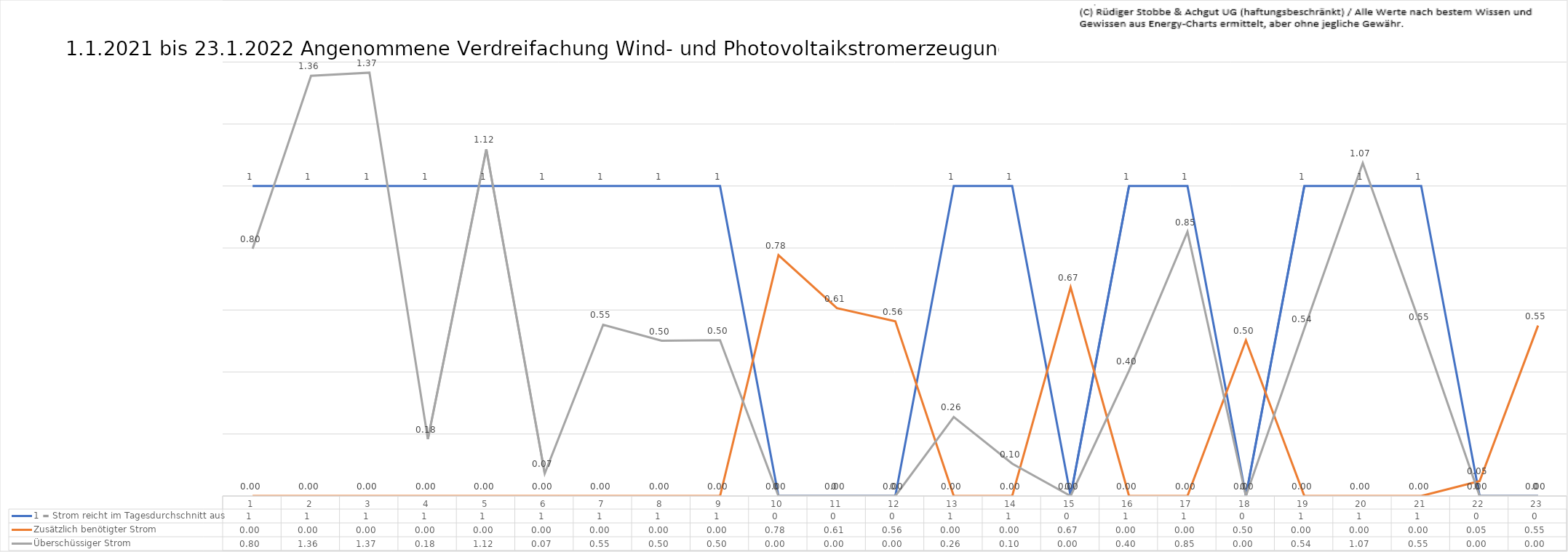
| Category | 1 = Strom reicht im Tagesdurchschnitt aus | Zusätzlich benötigter Strom | Überschüssiger Strom |
|---|---|---|---|
| 0 | 1 | 0 | 0.798 |
| 1 | 1 | 0 | 1.356 |
| 2 | 1 | 0 | 1.366 |
| 3 | 1 | 0 | 0.184 |
| 4 | 1 | 0 | 1.118 |
| 5 | 1 | 0 | 0.073 |
| 6 | 1 | 0 | 0.553 |
| 7 | 1 | 0 | 0.501 |
| 8 | 1 | 0 | 0.503 |
| 9 | 0 | 0.777 | 0 |
| 10 | 0 | 0.606 | 0 |
| 11 | 0 | 0.563 | 0 |
| 12 | 1 | 0 | 0.255 |
| 13 | 1 | 0 | 0.104 |
| 14 | 0 | 0.673 | 0 |
| 15 | 1 | 0 | 0.405 |
| 16 | 1 | 0 | 0.852 |
| 17 | 0 | 0.502 | 0 |
| 18 | 1 | 0 | 0.54 |
| 19 | 1 | 0 | 1.074 |
| 20 | 1 | 0 | 0.546 |
| 21 | 0 | 0.048 | 0 |
| 22 | 0 | 0.55 | 0 |